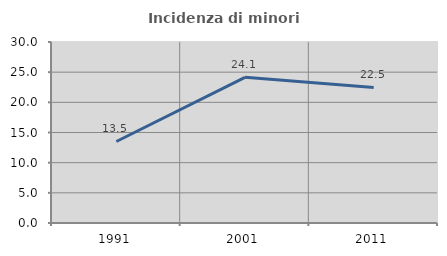
| Category | Incidenza di minori stranieri |
|---|---|
| 1991.0 | 13.514 |
| 2001.0 | 24.145 |
| 2011.0 | 22.461 |